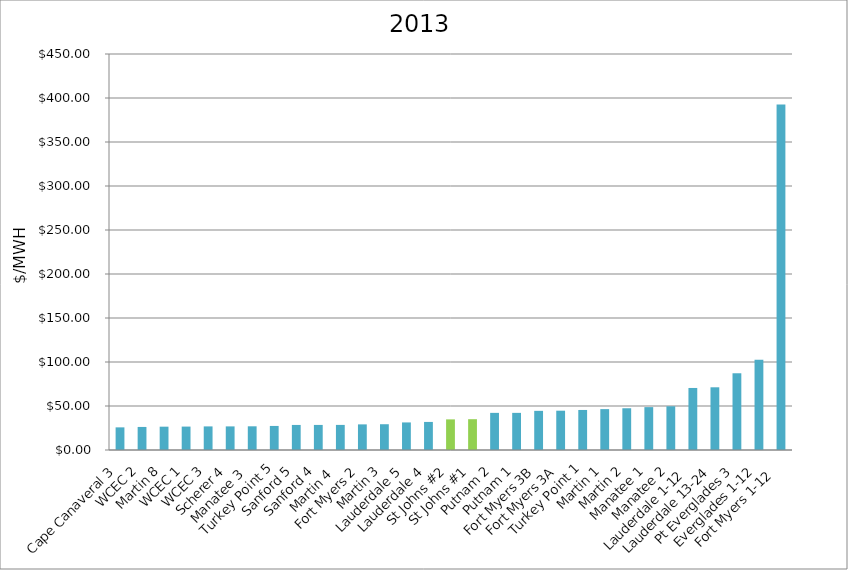
| Category | $/MWH |
|---|---|
| Cape Canaveral 3 | 25.722 |
| WCEC 2 | 26.198 |
| Martin 8 | 26.504 |
| WCEC 1 | 26.608 |
| WCEC 3 | 26.815 |
| Scherer 4 | 26.824 |
| Manatee 3  | 26.926 |
| Turkey Point 5 | 27.332 |
| Sanford 5 | 28.47 |
| Sanford 4 | 28.489 |
| Martin 4  | 28.52 |
| Fort Myers 2 | 29.122 |
| Martin 3 | 29.29 |
| Lauderdale 5 | 31.329 |
| Lauderdale 4 | 31.892 |
| St Johns #2 | 34.793 |
| St Johns #1 | 35 |
| Putnam 2 | 42.19 |
| Putnam 1 | 42.194 |
| Fort Myers 3B | 44.489 |
| Fort Myers 3A | 44.662 |
| Turkey Point 1 | 45.493 |
| Martin 1 | 46.455 |
| Martin 2 | 47.44 |
| Manatee 1 | 48.728 |
| Manatee 2 | 49.686 |
| Lauderdale 1-12  | 70.492 |
| Lauderdale 13-24 | 71.258 |
| Pt Everglades 3 | 87.204 |
| Everglades 1-12 | 102.698 |
| Fort Myers 1-12  | 392.556 |